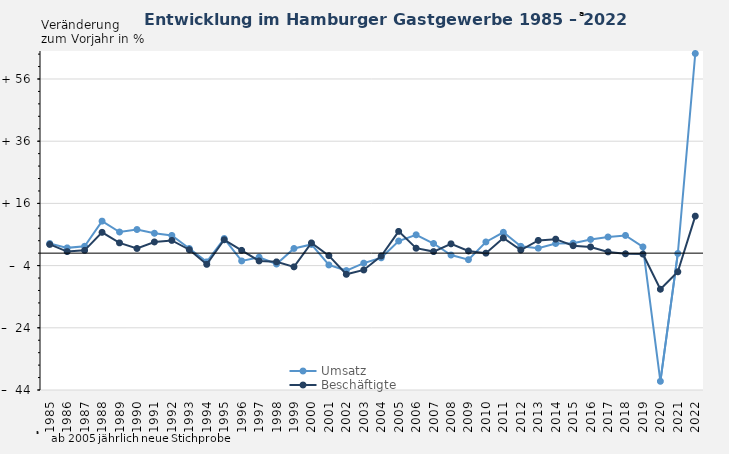
| Category | Umsatz | Beschäftigte |
|---|---|---|
| 1985.0 | 3.1 | 2.8 |
| 1986.0 | 1.7 | 0.5 |
| 1987.0 | 2.2 | 0.9 |
| 1988.0 | 10.3 | 6.7 |
| 1989.0 | 6.8 | 3.3 |
| 1990.0 | 7.6 | 1.5 |
| 1991.0 | 6.4 | 3.6 |
| 1992.0 | 5.7 | 4.1 |
| 1993.0 | 1.5 | 1.1 |
| 1994.0 | -2.8 | -3.6 |
| 1995.0 | 4.7 | 4.3 |
| 1996.0 | -2.5 | 0.9 |
| 1997.0 | -1.3 | -2.5 |
| 1998.0 | -3.5 | -2.8 |
| 1999.0 | 1.5 | -4.4 |
| 2000.0 | 2.8 | 3.3 |
| 2001.0 | -3.8 | -0.8 |
| 2002.0 | -5.6 | -6.8 |
| 2003.0 | -3.2 | -5.4 |
| 2004.0 | -1.5 | -0.9 |
| 2005.0 | 3.9 | 7 |
| 2006.0 | 5.9 | 1.6 |
| 2007.0 | 3.1 | 0.5 |
| 2008.0 | -0.6 | 3 |
| 2009.0 | -2.1 | 0.7 |
| 2010.0 | 3.6 | 0 |
| 2011.0 | 6.7 | 4.9 |
| 2012.0 | 2.2 | 1 |
| 2013.0 | 1.6 | 4.1 |
| 2014.0 | 3.1 | 4.5 |
| 2015.0 | 3.2 | 2.4 |
| 2016.0 | 4.4 | 2 |
| 2017.0 | 5.2 | 0.4 |
| 2018.0 | 5.7 | -0.2 |
| 2019.0 | 2 | -0.3 |
| 2020.0 | -41.2 | -11.6 |
| 2021.0 | -0.1 | -6 |
| 2022.0 | 64.2 | 11.9 |